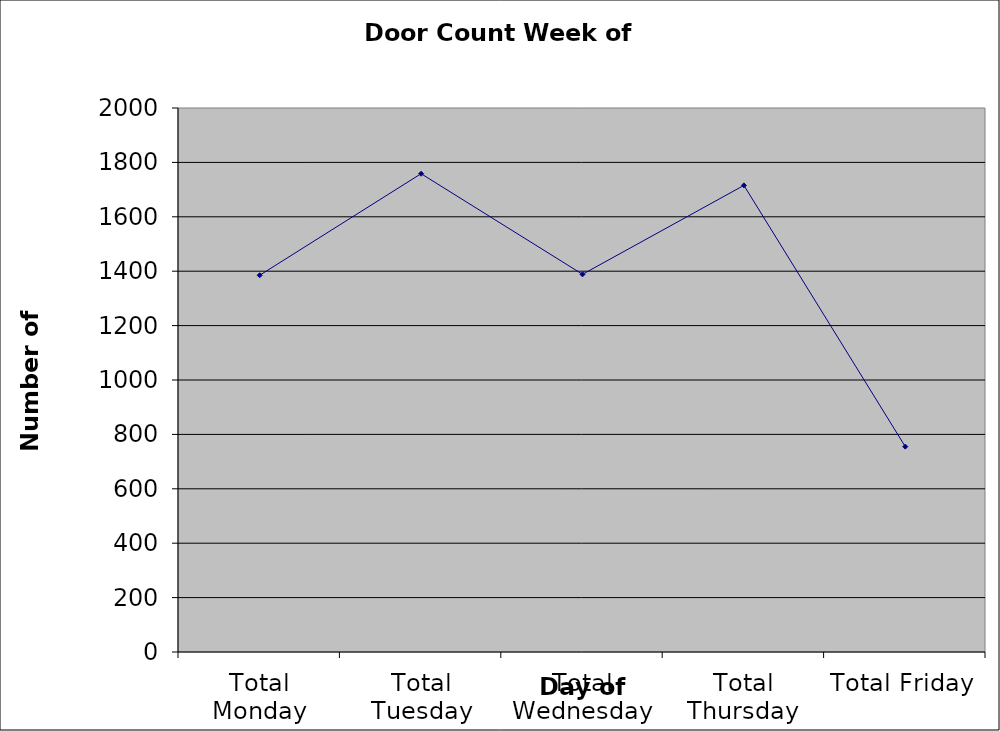
| Category | Series 0 |
|---|---|
| Total Monday | 1385 |
| Total Tuesday | 1758.5 |
| Total Wednesday | 1388.5 |
| Total Thursday | 1715.5 |
| Total Friday | 755 |